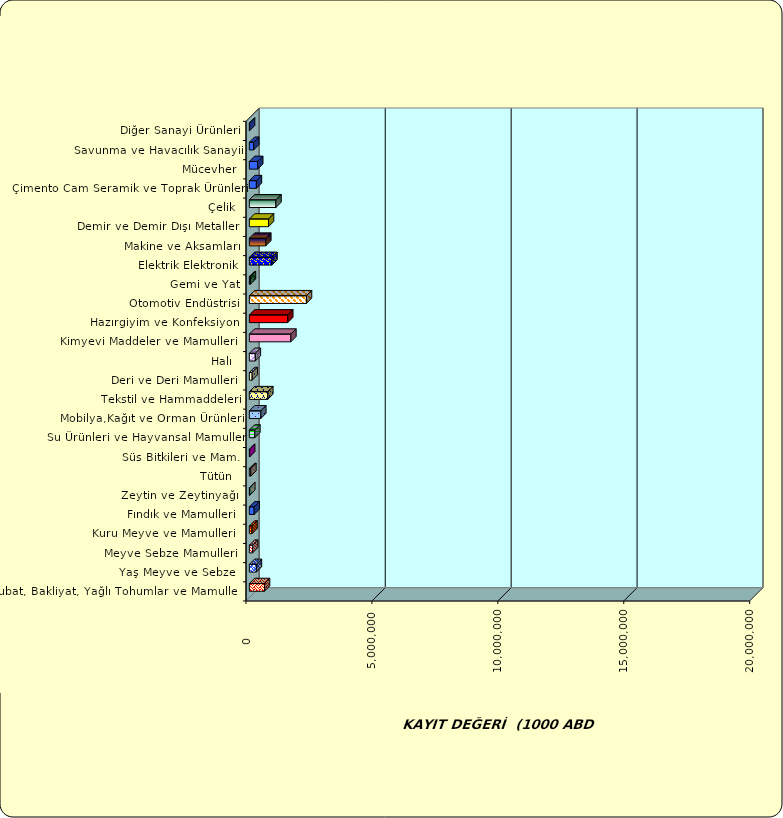
| Category | Series 0 |
|---|---|
|  Hububat, Bakliyat, Yağlı Tohumlar ve Mamulleri  | 601104.002 |
|  Yaş Meyve ve Sebze   | 279078.879 |
|  Meyve Sebze Mamulleri  | 129883.893 |
|  Kuru Meyve ve Mamulleri   | 104109.124 |
|  Fındık ve Mamulleri  | 191187.424 |
|  Zeytin ve Zeytinyağı  | 15961.904 |
|  Tütün  | 59333.604 |
|  Süs Bitkileri ve Mam. | 12015.773 |
|  Su Ürünleri ve Hayvansal Mamuller | 217213.809 |
|  Mobilya,Kağıt ve Orman Ürünleri | 454062.888 |
|  Tekstil ve Hammaddeleri | 731548.297 |
|  Deri ve Deri Mamulleri  | 110259.259 |
|  Halı  | 235676.646 |
|  Kimyevi Maddeler ve Mamulleri   | 1647917.363 |
|  Hazırgiyim ve Konfeksiyon  | 1523135.805 |
|  Otomotiv Endüstrisi | 2267426.569 |
|  Gemi ve Yat | 42744.005 |
|  Elektrik Elektronik | 897122.521 |
|  Makine ve Aksamları | 652608.306 |
|  Demir ve Demir Dışı Metaller  | 760570.112 |
|  Çelik | 1056325.469 |
|  Çimento Cam Seramik ve Toprak Ürünleri | 279255.845 |
|  Mücevher | 330860.72 |
|  Savunma ve Havacılık Sanayii | 172972.847 |
|  Diğer Sanayi Ürünleri | 7331.174 |